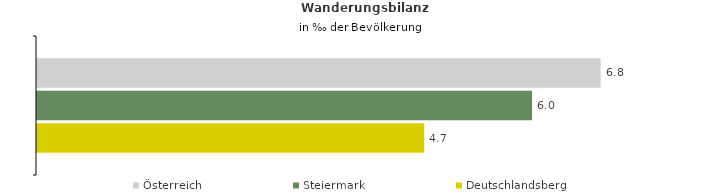
| Category | Österreich | Steiermark | Deutschlandsberg |
|---|---|---|---|
| Wanderungsrate in ‰ der Bevölkerung, Periode 2018-2022 | 6.822 | 5.992 | 4.686 |